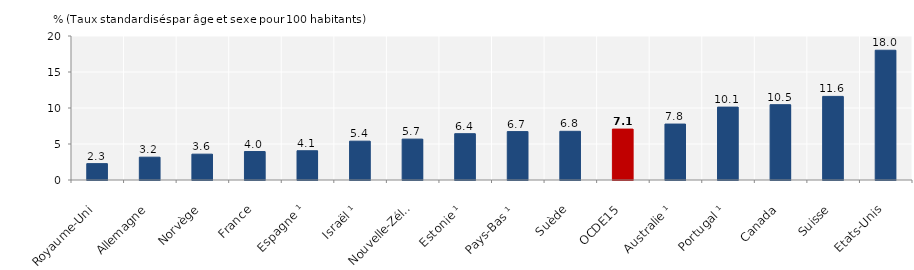
| Category | 2016 |
|---|---|
| Royaume-Uni | 2.273 |
| Allemagne | 3.169 |
| Norvège | 3.588 |
| France | 3.954 |
| Espagne ¹ | 4.063 |
| Israël ¹ | 5.394 |
| Nouvelle-Zélande ¹ | 5.678 |
| Estonie ¹ | 6.434 |
| Pays-Bas ¹ | 6.723 |
| Suède | 6.764 |
| OCDE15 | 7.068 |
| Australie ¹ | 7.768 |
| Portugal ¹ | 10.123 |
| Canada | 10.46 |
| Suisse | 11.612 |
| Etats-Unis | 18.021 |